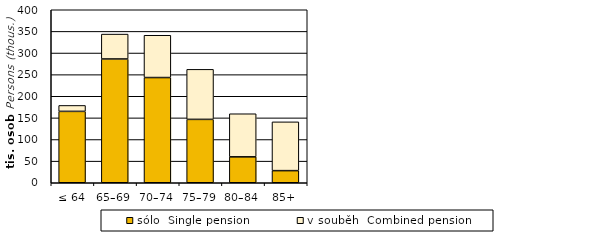
| Category | sólo  Single pension | v souběh  Combined pension |
|---|---|---|
| ≤ 64 | 165058 | 13705 |
| 65–69 | 286231 | 57505 |
| 70–74 | 243262 | 97798 |
| 75–79 | 146547 | 115667 |
| 80–84 | 59918 | 99622 |
| 85+ | 28000 | 112817 |